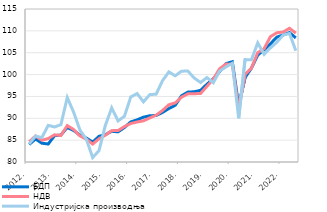
| Category | БДП | НДВ | Индустријска производња |
|---|---|---|---|
| 2012. | 84.018 | 84.612 | 84.123 |
| II | 85.258 | 85.96 | 85.93 |
| III | 84.302 | 84.992 | 85.589 |
| IV | 84.116 | 85.358 | 88.385 |
| 2013. | 86.02 | 86.217 | 88.012 |
| II | 86.175 | 86.066 | 88.554 |
| III | 87.892 | 88.326 | 94.747 |
| IV | 87.218 | 87.438 | 91.408 |
| 2014. | 86.152 | 85.98 | 87.283 |
| II | 85.484 | 85.23 | 85.237 |
| III | 84.559 | 84.096 | 81.017 |
| IV | 85.868 | 85.308 | 82.596 |
| 2015. | 86.262 | 86.126 | 88.39 |
| II | 87.023 | 87.171 | 92.377 |
| III | 86.897 | 87.198 | 89.401 |
| IV | 87.886 | 88.099 | 90.454 |
| 2016. | 89.166 | 88.801 | 94.877 |
| II | 89.646 | 89.152 | 95.655 |
| III | 90.249 | 89.415 | 93.762 |
| IV | 90.577 | 90.087 | 95.414 |
| 2017. | 90.641 | 90.715 | 95.522 |
| II | 91.332 | 91.781 | 98.6 |
| III | 92.227 | 93.099 | 100.615 |
| IV | 92.975 | 93.517 | 99.718 |
| 2018. | 95.156 | 94.822 | 100.784 |
| II | 95.991 | 95.589 | 100.795 |
| III | 96.075 | 95.614 | 99.203 |
| IV | 96.399 | 95.689 | 98.191 |
| 2019. | 97.791 | 97.306 | 99.319 |
| II | 99.022 | 98.94 | 98.127 |
| III | 100.682 | 101.344 | 100.795 |
| IV | 102.505 | 102.41 | 101.76 |
| 2020. | 102.935 | 102.319 | 102.578 |
| II | 92.928 | 92.115 | 90 |
| III | 99.313 | 100.067 | 103.429 |
| IV | 101.448 | 101.436 | 103.366 |
| 2021. | 104.465 | 105.028 | 107.265 |
| II | 105.666 | 105.913 | 104.636 |
| III | 107.038 | 108.676 | 106.091 |
| IV | 108.563 | 109.568 | 107.387 |
| 2022. | 109.057 | 109.723 | 109.044 |
| II | 109.608 | 110.591 | 109.405 |
| III | 108.382 | 109.482 | 105.457 |